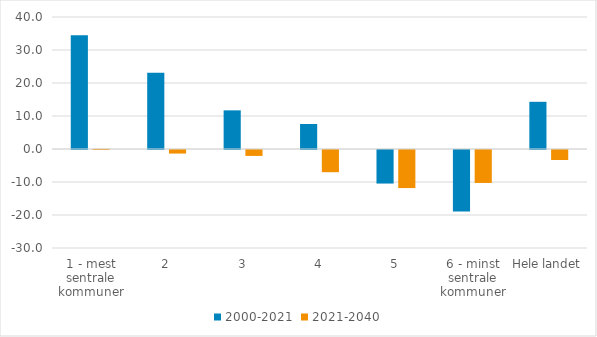
| Category | 2000-2021 | 2021-2040 |
|---|---|---|
| 1 - mest sentrale kommuner | 34.455 | 0.047 |
| 2 | 23.136 | -1.081 |
| 3 | 11.715 | -1.793 |
| 4 | 7.574 | -6.728 |
| 5 | -10.169 | -11.539 |
| 6 - minst sentrale kommuner | -18.656 | -9.988 |
| Hele landet | 14.301 | -3.037 |